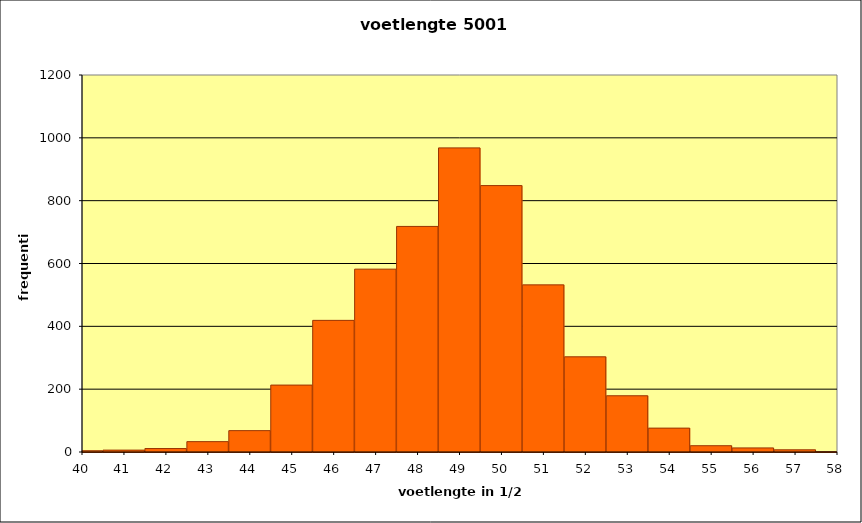
| Category | Series 0 |
|---|---|
| 58.0 | 1 |
| 57.0 | 7 |
| 56.0 | 13 |
| 55.0 | 20 |
| 54.0 | 76 |
| 53.0 | 179 |
| 52.0 | 303 |
| 51.0 | 532 |
| 50.0 | 848 |
| 49.0 | 968 |
| 48.0 | 718 |
| 47.0 | 582 |
| 46.0 | 419 |
| 45.0 | 213 |
| 44.0 | 68 |
| 43.0 | 33 |
| 42.0 | 11 |
| 41.0 | 6 |
| 40.0 | 4 |